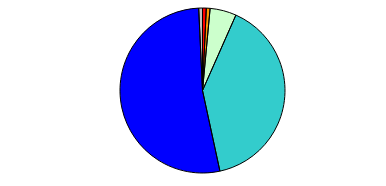
| Category | Series 0 |
|---|---|
| 0 | 5 |
| 1 | 5 |
| 2 | 35 |
| 3 | 271 |
| 4 | 357 |
| 5 | 5 |